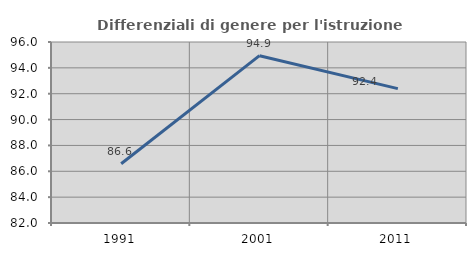
| Category | Differenziali di genere per l'istruzione superiore |
|---|---|
| 1991.0 | 86.579 |
| 2001.0 | 94.943 |
| 2011.0 | 92.396 |